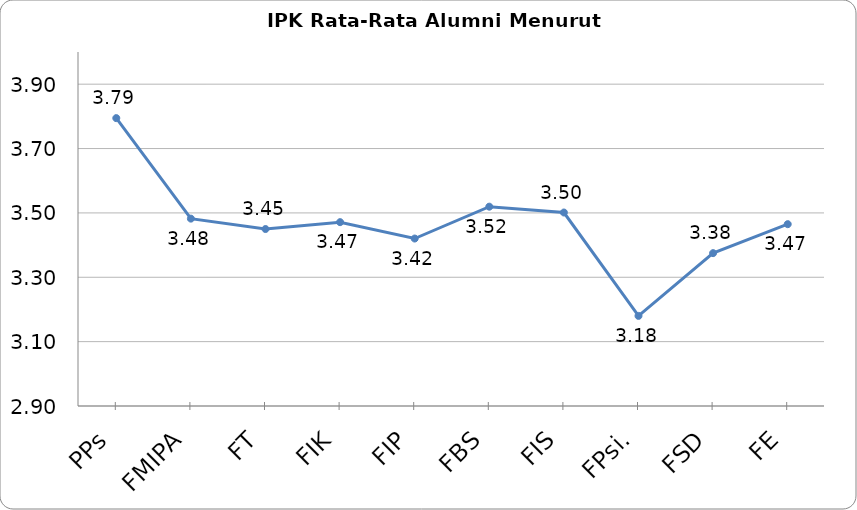
| Category | Series 0 |
|---|---|
| PPs | 3.795 |
| FMIPA | 3.482 |
| FT | 3.45 |
| FIK | 3.471 |
| FIP | 3.42 |
| FBS | 3.519 |
| FIS | 3.501 |
| FPsi. | 3.18 |
| FSD | 3.375 |
| FE | 3.465 |